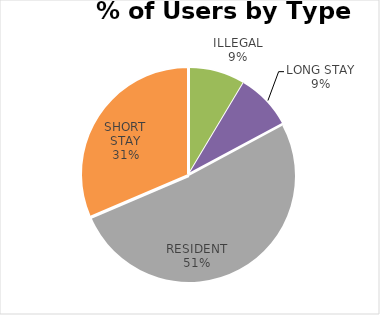
| Category | HOBART PLACE |
|---|---|
| COMMUTER | 0 |
| ILLEGAL | 3 |
| LONG STAY | 3 |
| RESIDENT | 18 |
| SHORT STAY | 11 |
| DISABLED | 0 |
| OTHER | 0 |